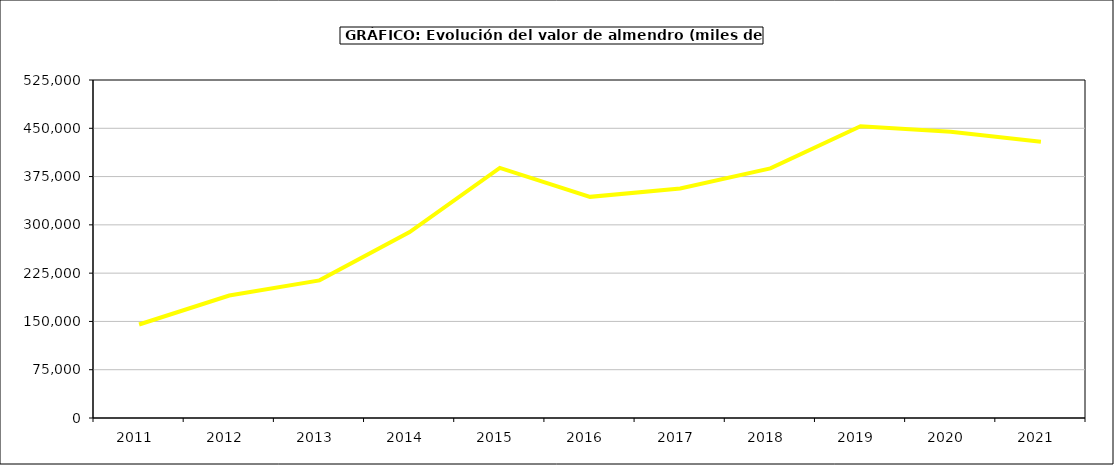
| Category | valor almendro |
|---|---|
| 2011.0 | 145270.034 |
| 2012.0 | 190305.336 |
| 2013.0 | 213791.63 |
| 2014.0 | 288832.154 |
| 2015.0 | 388475 |
| 2016.0 | 343509 |
| 2017.0 | 356619.875 |
| 2018.0 | 387785.945 |
| 2019.0 | 453304.604 |
| 2020.0 | 444587.745 |
| 2021.0 | 429147.738 |